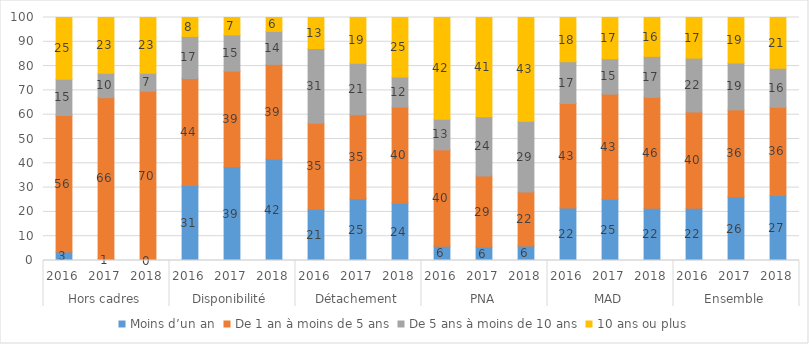
| Category | Moins d’un an | De 1 an à moins de 5 ans | De 5 ans à moins de 10 ans | 10 ans ou plus |
|---|---|---|---|---|
| 0 | 3.454 | 56.201 | 14.914 | 25.432 |
| 1 | 0.604 | 66.398 | 10.06 | 22.938 |
| 2 | 0 | 69.672 | 7.377 | 22.951 |
| 3 | 30.883 | 44.012 | 17.311 | 7.795 |
| 4 | 38.612 | 39.327 | 14.917 | 7.145 |
| 5 | 41.736 | 38.987 | 13.556 | 5.721 |
| 6 | 21.066 | 35.411 | 30.759 | 12.764 |
| 7 | 25.369 | 34.574 | 21.22 | 18.837 |
| 8 | 23.593 | 39.504 | 12.372 | 24.532 |
| 9 | 5.894 | 39.644 | 12.64 | 41.822 |
| 10 | 5.526 | 29.2 | 24.438 | 40.837 |
| 11 | 5.975 | 22.222 | 29.091 | 42.712 |
| 12 | 21.638 | 42.994 | 17.164 | 18.205 |
| 13 | 25.17 | 43.298 | 14.577 | 16.955 |
| 14 | 21.53 | 45.6 | 16.87 | 16 |
| 15 | 21.54 | 39.557 | 22.175 | 16.728 |
| 16 | 26.274 | 35.707 | 19.295 | 18.724 |
| 17 | 26.747 | 36.309 | 16.08 | 20.864 |